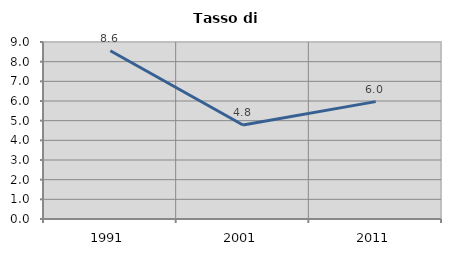
| Category | Tasso di disoccupazione   |
|---|---|
| 1991.0 | 8.553 |
| 2001.0 | 4.781 |
| 2011.0 | 5.969 |